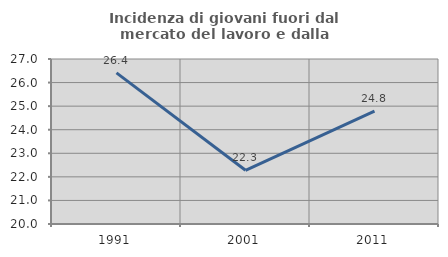
| Category | Incidenza di giovani fuori dal mercato del lavoro e dalla formazione  |
|---|---|
| 1991.0 | 26.413 |
| 2001.0 | 22.278 |
| 2011.0 | 24.787 |